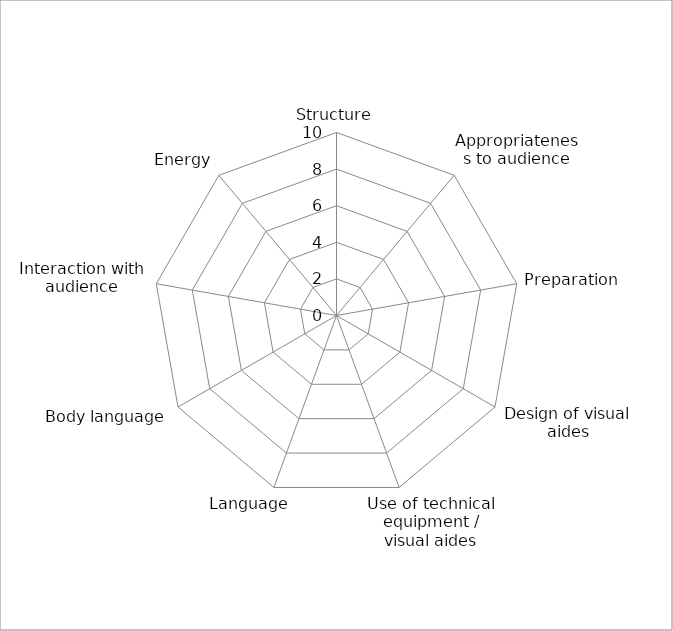
| Category | Series 0 |
|---|---|
| Structure | 0 |
| Appropriateness to audience | 0 |
| Preparation | 0 |
| Design of visual aides | 0 |
| Use of technical equipment / visual aides | 0 |
| Language | 0 |
| Body language | 0 |
| Interaction with audience | 0 |
| Energy | 0 |